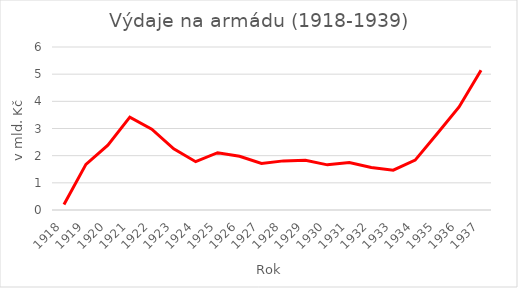
| Category | Series 0 |
|---|---|
| 1918.0 | 203 |
| 1919.0 | 1679 |
| 1920.0 | 2385 |
| 1921.0 | 3420 |
| 1922.0 | 2976 |
| 1923.0 | 2249 |
| 1924.0 | 1778 |
| 1925.0 | 2108 |
| 1926.0 | 1977 |
| 1927.0 | 1714 |
| 1928.0 | 1808 |
| 1929.0 | 1828 |
| 1930.0 | 1662 |
| 1931.0 | 1747 |
| 1932.0 | 1562 |
| 1933.0 | 1467 |
| 1934.0 | 1836 |
| 1935.0 | 2804 |
| 1936.0 | 3793 |
| 1937.0 | 5146 |